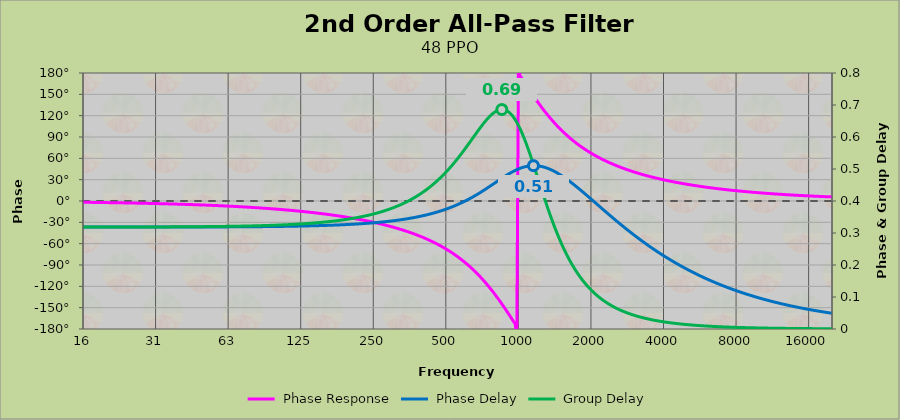
| Category |  Phase Response |
|---|---|
| 10.0 | -1.146 |
| 10.144952080687357 | -1.163 |
| 10.292005271944277 | -1.179 |
| 10.441190029805636 | -1.197 |
| 10.592537251772882 | -1.214 |
| 10.746078283213167 | -1.232 |
| 10.901844923851277 | -1.249 |
| 11.059869434355585 | -1.267 |
| 11.220184543019634 | -1.286 |
| 11.38282345254031 | -1.304 |
| 11.547819846894582 | -1.323 |
| 11.715207898315597 | -1.343 |
| 11.885022274370181 | -1.362 |
| 12.05729814513874 | -1.382 |
| 12.232071190499312 | -1.402 |
| 12.40937760751719 | -1.422 |
| 12.589254117941664 | -1.443 |
| 12.771737975811421 | -1.464 |
| 12.956866975170186 | -1.485 |
| 13.144679457894211 | -1.506 |
| 13.33521432163323 | -1.528 |
| 13.528511027866504 | -1.55 |
| 13.724609610075607 | -1.573 |
| 13.923550682035842 | -1.596 |
| 14.125375446227528 | -1.619 |
| 14.330125702369624 | -1.642 |
| 14.537843856076616 | -1.666 |
| 14.748572927641241 | -1.69 |
| 14.96235656094433 | -1.715 |
| 15.179239032493834 | -1.74 |
| 15.399265260594913 | -1.765 |
| 15.622480814652896 | -1.79 |
| 15.848931924611124 | -1.816 |
| 16.078665490525598 | -1.843 |
| 16.311729092278373 | -1.87 |
| 16.548170999431804 | -1.897 |
| 16.788040181225604 | -1.924 |
| 17.031386316718756 | -1.952 |
| 17.278259805078633 | -1.98 |
| 17.528711776018913 | -2.009 |
| 17.782794100389225 | -2.038 |
| 18.04055940091786 | -2.068 |
| 18.302061063110557 | -2.098 |
| 18.567353246307057 | -2.128 |
| 18.836490894897995 | -2.159 |
| 19.109529749704397 | -2.19 |
| 19.386526359522072 | -2.222 |
| 19.66753809283337 | -2.254 |
| 19.95262314968879 | -2.287 |
| 20.2418405737606 | -2.32 |
| 20.535250264571452 | -2.354 |
| 20.832912989899985 | -2.388 |
| 21.13489039836646 | -2.423 |
| 21.441245032200722 | -2.458 |
| 21.75204034019521 | -2.493 |
| 22.067340690845896 | -2.53 |
| 22.38721138568339 | -2.566 |
| 22.711718672797648 | -2.603 |
| 23.04092976055845 | -2.641 |
| 23.37491283153488 | -2.68 |
| 23.71373705661654 | -2.718 |
| 24.057472609339506 | -2.758 |
| 24.40619068041979 | -2.798 |
| 24.75996349249773 | -2.838 |
| 25.11886431509578 | -2.88 |
| 25.482967479793462 | -2.921 |
| 25.852348395621906 | -2.964 |
| 26.22708356468189 | -3.007 |
| 26.60725059798809 | -3.05 |
| 26.992928231542923 | -3.095 |
| 27.38419634264361 | -3.14 |
| 27.78113596642535 | -3.185 |
| 28.183829312644534 | -3.231 |
| 28.592359782705056 | -3.278 |
| 29.006811986931528 | -3.326 |
| 29.427271762092804 | -3.374 |
| 29.853826189179596 | -3.423 |
| 30.28656361143962 | -3.473 |
| 30.725573652674463 | -3.523 |
| 31.170947235801233 | -3.574 |
| 31.622776601683785 | -3.626 |
| 32.08115532823636 | -3.679 |
| 32.54617834980458 | -3.732 |
| 33.017941976827196 | -3.786 |
| 33.496543915782745 | -3.841 |
| 33.98208328942559 | -3.897 |
| 34.47466065731493 | -3.954 |
| 34.97437803664178 | -4.011 |
| 35.481338923357534 | -4.069 |
| 35.995648313608946 | -4.128 |
| 36.51741272548376 | -4.188 |
| 37.046740221071566 | -4.249 |
| 37.58374042884439 | -4.311 |
| 38.128524566361875 | -4.373 |
| 38.68120546330519 | -4.437 |
| 39.24189758484535 | -4.501 |
| 39.81071705534973 | -4.567 |
| 40.38778168243259 | -4.633 |
| 40.97321098135415 | -4.7 |
| 41.567126199773085 | -4.769 |
| 42.16965034285822 | -4.838 |
| 42.7809081987638 | -4.908 |
| 43.40102636447437 | -4.98 |
| 44.03013327202412 | -5.052 |
| 44.668359215096295 | -5.125 |
| 45.31583637600815 | -5.2 |
| 45.97269885308721 | -5.276 |
| 46.639082688444034 | -5.352 |
| 47.31512589614804 | -5.43 |
| 48.00096849081114 | -5.509 |
| 48.6967525165863 | -5.589 |
| 49.40262207658598 | -5.67 |
| 50.11872336272721 | -5.753 |
| 50.84520468600938 | -5.836 |
| 51.58221650723054 | -5.921 |
| 52.32991146814946 | -6.008 |
| 53.08844442309883 | -6.095 |
| 53.85797247105717 | -6.184 |
| 54.6386549881854 | -6.274 |
| 55.43065366083503 | -6.365 |
| 56.23413251903489 | -6.458 |
| 57.049257970463195 | -6.552 |
| 57.87619883491205 | -6.647 |
| 58.71512637925165 | -6.744 |
| 59.566214352901035 | -6.842 |
| 60.42963902381326 | -6.942 |
| 61.30557921498207 | -7.043 |
| 62.194216341477585 | -7.145 |
| 63.095734448019314 | -7.249 |
| 64.01032024709305 | -7.355 |
| 64.93816315762112 | -7.462 |
| 65.87945534419237 | -7.571 |
| 66.83439175686144 | -7.681 |
| 67.8031701715246 | -7.794 |
| 68.78599123088073 | -7.907 |
| 69.78305848598663 | -8.023 |
| 70.7945784384138 | -8.14 |
| 71.82076058301705 | -8.258 |
| 72.86181745132275 | -8.379 |
| 73.91796465554594 | -8.501 |
| 74.98942093324555 | -8.625 |
| 76.07640819262701 | -8.751 |
| 77.1791515585012 | -8.879 |
| 78.29787941891024 | -9.009 |
| 79.4328234724281 | -9.141 |
| 80.58421877614816 | -9.274 |
| 81.75230379436502 | -9.41 |
| 82.93732044796283 | -9.548 |
| 84.13951416451951 | -9.687 |
| 85.35913392913655 | -9.829 |
| 86.59643233600653 | -9.973 |
| 87.85166564072718 | -10.119 |
| 89.12509381337453 | -10.267 |
| 90.41698059234503 | -10.418 |
| 91.72759353897793 | -10.57 |
| 93.05720409296987 | -10.725 |
| 94.40608762859233 | -10.883 |
| 95.77452351172407 | -11.042 |
| 97.16279515771062 | -11.204 |
| 98.57119009006156 | -11.369 |
| 100.0 | -11.536 |
| 101.4495208068736 | -11.705 |
| 102.92005271944278 | -11.877 |
| 104.41190029805644 | -12.052 |
| 105.92537251772887 | -12.229 |
| 107.46078283213174 | -12.409 |
| 109.01844923851274 | -12.592 |
| 110.59869434355593 | -12.777 |
| 112.20184543019631 | -12.966 |
| 113.82823452540316 | -13.157 |
| 115.47819846894579 | -13.351 |
| 117.15207898315593 | -13.548 |
| 118.85022274370179 | -13.748 |
| 120.5729814513874 | -13.951 |
| 122.32071190499315 | -14.157 |
| 124.09377607517195 | -14.367 |
| 125.89254117941667 | -14.579 |
| 127.71737975811426 | -14.795 |
| 129.56866975170195 | -15.014 |
| 131.44679457894225 | -15.237 |
| 133.35214321633237 | -15.463 |
| 135.28511027866503 | -15.693 |
| 137.24609610075618 | -15.926 |
| 139.2355068203584 | -16.163 |
| 141.25375446227542 | -16.403 |
| 143.30125702369625 | -16.647 |
| 145.37843856076614 | -16.895 |
| 147.4857292764124 | -17.147 |
| 149.62356560944335 | -17.403 |
| 151.79239032493837 | -17.663 |
| 153.99265260594916 | -17.927 |
| 156.224808146529 | -18.195 |
| 158.4893192461113 | -18.468 |
| 160.78665490525609 | -18.745 |
| 163.1172909227838 | -19.026 |
| 165.4817099943181 | -19.312 |
| 167.880401812256 | -19.602 |
| 170.31386316718766 | -19.897 |
| 172.78259805078633 | -20.197 |
| 175.28711776018926 | -20.502 |
| 177.82794100389225 | -20.811 |
| 180.40559400917857 | -21.126 |
| 183.02061063110554 | -21.446 |
| 185.6735324630706 | -21.771 |
| 188.36490894898003 | -22.101 |
| 191.09529749704402 | -22.437 |
| 193.86526359522065 | -22.778 |
| 196.67538092833377 | -23.125 |
| 199.52623149688796 | -23.478 |
| 202.41840573760615 | -23.837 |
| 205.3525026457146 | -24.201 |
| 208.3291298989999 | -24.572 |
| 211.34890398366466 | -24.949 |
| 214.41245032200723 | -25.333 |
| 217.52040340195225 | -25.723 |
| 220.67340690845893 | -26.12 |
| 223.87211385683392 | -26.523 |
| 227.1171867279765 | -26.934 |
| 230.40929760558453 | -27.352 |
| 233.74912831534877 | -27.777 |
| 237.1373705661655 | -28.209 |
| 240.5747260933951 | -28.649 |
| 244.061906804198 | -29.097 |
| 247.59963492497735 | -29.553 |
| 251.188643150958 | -30.017 |
| 254.82967479793462 | -30.489 |
| 258.523483956219 | -30.97 |
| 262.27083564681897 | -31.459 |
| 266.07250597988093 | -31.958 |
| 269.92928231542936 | -32.465 |
| 273.84196342643605 | -32.982 |
| 277.8113596642535 | -33.508 |
| 281.8382931264453 | -34.045 |
| 285.9235978270507 | -34.591 |
| 290.0681198693154 | -35.148 |
| 294.2727176209282 | -35.715 |
| 298.53826189179597 | -36.293 |
| 302.8656361143963 | -36.882 |
| 307.2557365267447 | -37.483 |
| 311.70947235801253 | -38.095 |
| 316.22776601683796 | -38.719 |
| 320.81155328236355 | -39.356 |
| 325.46178349804586 | -40.005 |
| 330.179419768272 | -40.667 |
| 334.96543915782763 | -41.343 |
| 339.82083289425583 | -42.032 |
| 344.74660657314934 | -42.735 |
| 349.74378036641787 | -43.453 |
| 354.81338923357544 | -44.186 |
| 359.9564831360896 | -44.934 |
| 365.1741272548377 | -45.698 |
| 370.46740221071565 | -46.477 |
| 375.83740428844413 | -47.274 |
| 381.28524566361875 | -48.088 |
| 386.8120546330522 | -48.919 |
| 392.41897584845356 | -49.768 |
| 398.1071705534972 | -50.636 |
| 403.877816824326 | -51.524 |
| 409.73210981354146 | -52.431 |
| 415.67126199773105 | -53.358 |
| 421.6965034285822 | -54.307 |
| 427.809081987638 | -55.277 |
| 434.0102636447438 | -56.27 |
| 440.3013327202413 | -57.286 |
| 446.68359215096314 | -58.325 |
| 453.1583637600817 | -59.389 |
| 459.72698853087206 | -60.478 |
| 466.3908268844406 | -61.593 |
| 473.1512589614805 | -62.736 |
| 480.0096849081115 | -63.905 |
| 486.96752516586304 | -65.104 |
| 494.02622076585976 | -66.331 |
| 501.18723362727224 | -67.59 |
| 508.45204686009384 | -68.879 |
| 515.8221650723056 | -70.201 |
| 523.2991146814948 | -71.556 |
| 530.8844442309883 | -72.946 |
| 538.5797247105719 | -74.371 |
| 546.3865498818542 | -75.832 |
| 554.3065366083505 | -77.331 |
| 562.341325190349 | -78.868 |
| 570.4925797046319 | -80.446 |
| 578.7619883491207 | -82.064 |
| 587.1512637925165 | -83.725 |
| 595.6621435290103 | -85.429 |
| 604.2963902381327 | -87.177 |
| 613.0557921498206 | -88.971 |
| 621.9421634147761 | -90.812 |
| 630.9573444801932 | -92.701 |
| 640.1032024709308 | -94.639 |
| 649.3816315762114 | -96.627 |
| 658.7945534419239 | -98.666 |
| 668.3439175686145 | -100.758 |
| 678.0317017152458 | -102.903 |
| 687.8599123088075 | -105.101 |
| 697.8305848598662 | -107.355 |
| 707.9457843841379 | -109.664 |
| 718.2076058301706 | -112.028 |
| 728.6181745132277 | -114.45 |
| 739.1796465554596 | -116.927 |
| 749.8942093324558 | -119.462 |
| 760.7640819262703 | -122.053 |
| 771.7915155850123 | -124.7 |
| 782.9787941891024 | -127.403 |
| 794.3282347242815 | -130.161 |
| 805.8421877614819 | -132.973 |
| 817.52303794365 | -135.837 |
| 829.3732044796284 | -138.752 |
| 841.395141645195 | -141.715 |
| 853.5913392913658 | -144.726 |
| 865.9643233600654 | -147.781 |
| 878.5166564072719 | -150.877 |
| 891.2509381337454 | -154.011 |
| 904.1698059234504 | -157.18 |
| 917.2759353897795 | -160.38 |
| 930.572040929699 | -163.607 |
| 944.0608762859234 | -166.858 |
| 957.7452351172412 | -170.127 |
| 971.6279515771062 | -173.41 |
| 985.7119009006161 | -176.703 |
| 1000.0 | 180 |
| 1014.4952080687361 | 176.703 |
| 1029.2005271944283 | 173.41 |
| 1044.1190029805643 | 170.127 |
| 1059.253725177289 | 166.858 |
| 1074.6078283213174 | 163.607 |
| 1090.1844923851277 | 160.38 |
| 1105.9869434355596 | 157.18 |
| 1122.0184543019636 | 154.011 |
| 1138.282345254032 | 150.877 |
| 1154.7819846894583 | 147.781 |
| 1171.52078983156 | 144.726 |
| 1188.5022274370185 | 141.715 |
| 1205.7298145138743 | 138.752 |
| 1223.2071190499316 | 135.837 |
| 1240.9377607517197 | 132.973 |
| 1258.9254117941673 | 130.161 |
| 1277.173797581143 | 127.403 |
| 1295.6866975170196 | 124.7 |
| 1314.4679457894222 | 122.053 |
| 1333.5214321633239 | 119.462 |
| 1352.8511027866502 | 116.927 |
| 1372.460961007562 | 114.45 |
| 1392.355068203584 | 112.028 |
| 1412.5375446227545 | 109.664 |
| 1433.012570236963 | 107.355 |
| 1453.784385607662 | 105.101 |
| 1474.8572927641246 | 102.903 |
| 1496.2356560944334 | 100.758 |
| 1517.923903249384 | 98.666 |
| 1539.926526059492 | 96.627 |
| 1562.2480814652904 | 94.639 |
| 1584.8931924611136 | 92.701 |
| 1607.8665490525607 | 90.812 |
| 1631.1729092278383 | 88.971 |
| 1654.8170999431816 | 87.177 |
| 1678.8040181225606 | 85.429 |
| 1703.1386316718772 | 83.725 |
| 1727.8259805078635 | 82.064 |
| 1752.871177601893 | 80.446 |
| 1778.279410038923 | 78.868 |
| 1804.0559400917864 | 77.331 |
| 1830.2061063110561 | 75.832 |
| 1856.7353246307061 | 74.371 |
| 1883.6490894898009 | 72.946 |
| 1910.9529749704407 | 71.556 |
| 1938.6526359522074 | 70.201 |
| 1966.7538092833386 | 68.879 |
| 1995.2623149688798 | 67.59 |
| 2024.1840573760617 | 66.331 |
| 2053.5250264571464 | 65.104 |
| 2083.2912989899996 | 63.905 |
| 2113.489039836647 | 62.736 |
| 2144.1245032200723 | 61.593 |
| 2175.204034019523 | 60.478 |
| 2206.73406908459 | 59.389 |
| 2238.7211385683395 | 58.325 |
| 2271.171867279766 | 57.286 |
| 2304.0929760558456 | 56.27 |
| 2337.4912831534884 | 55.277 |
| 2371.3737056616555 | 54.307 |
| 2405.7472609339507 | 53.358 |
| 2440.6190680419804 | 52.431 |
| 2475.9963492497736 | 51.524 |
| 2511.8864315095807 | 50.636 |
| 2548.296747979347 | 49.768 |
| 2585.2348395621907 | 48.919 |
| 2622.7083564681907 | 48.088 |
| 2660.7250597988095 | 47.274 |
| 2699.2928231542937 | 46.477 |
| 2738.4196342643613 | 45.698 |
| 2778.1135966425354 | 44.934 |
| 2818.3829312644543 | 44.186 |
| 2859.2359782705066 | 43.453 |
| 2900.6811986931543 | 42.735 |
| 2942.7271762092823 | 42.032 |
| 2985.38261891796 | 41.343 |
| 3028.6563611439637 | 40.667 |
| 3072.5573652674466 | 40.005 |
| 3117.0947235801264 | 39.356 |
| 3162.2776601683795 | 38.719 |
| 3208.115532823636 | 38.095 |
| 3254.6178349804586 | 37.483 |
| 3301.7941976827206 | 36.882 |
| 3349.6543915782772 | 36.293 |
| 3398.208328942559 | 35.715 |
| 3447.4660657314935 | 35.148 |
| 3497.4378036641783 | 34.591 |
| 3548.1338923357553 | 34.045 |
| 3599.5648313608967 | 33.508 |
| 3651.7412725483778 | 32.982 |
| 3704.6740221071573 | 32.465 |
| 3758.374042884442 | 31.958 |
| 3812.8524566361893 | 31.459 |
| 3868.1205463305223 | 30.97 |
| 3924.189758484536 | 30.489 |
| 3981.071705534973 | 30.017 |
| 4038.77816824326 | 29.553 |
| 4097.321098135415 | 29.097 |
| 4156.71261997731 | 28.649 |
| 4216.965034285823 | 28.209 |
| 4278.090819876382 | 27.777 |
| 4340.102636447438 | 27.352 |
| 4403.013327202415 | 26.934 |
| 4466.835921509632 | 26.523 |
| 4531.583637600818 | 26.12 |
| 4597.269885308722 | 25.723 |
| 4663.908268844407 | 25.333 |
| 4731.512589614806 | 24.949 |
| 4800.0968490811165 | 24.572 |
| 4869.675251658632 | 24.201 |
| 4940.2622076585985 | 23.837 |
| 5011.872336272723 | 23.478 |
| 5084.520468600941 | 23.125 |
| 5158.221650723059 | 22.778 |
| 5232.991146814948 | 22.437 |
| 5308.8444423098845 | 22.101 |
| 5385.797247105719 | 21.771 |
| 5463.865498818544 | 21.446 |
| 5543.065366083507 | 21.126 |
| 5623.413251903492 | 20.811 |
| 5704.92579704632 | 20.502 |
| 5787.619883491207 | 20.197 |
| 5871.512637925167 | 19.897 |
| 5956.621435290105 | 19.602 |
| 6042.963902381329 | 19.312 |
| 6130.557921498207 | 19.026 |
| 6219.421634147761 | 18.745 |
| 6309.573444801934 | 18.468 |
| 6401.03202470931 | 18.195 |
| 6493.816315762115 | 17.927 |
| 6587.945534419239 | 17.663 |
| 6683.439175686146 | 17.403 |
| 6780.317017152461 | 17.147 |
| 6878.599123088078 | 16.895 |
| 6978.305848598665 | 16.647 |
| 7079.457843841379 | 16.403 |
| 7182.076058301706 | 16.163 |
| 7286.181745132279 | 15.926 |
| 7391.796465554597 | 15.693 |
| 7498.942093324559 | 15.463 |
| 7607.640819262701 | 15.237 |
| 7717.9151558501235 | 15.014 |
| 7829.787941891026 | 14.795 |
| 7943.282347242817 | 14.579 |
| 8058.421877614819 | 14.367 |
| 8175.230379436501 | 14.157 |
| 8293.732044796287 | 13.951 |
| 8413.951416451955 | 13.748 |
| 8535.913392913662 | 13.548 |
| 8659.643233600656 | 13.351 |
| 8785.16656407272 | 13.157 |
| 8912.509381337457 | 12.966 |
| 9041.698059234506 | 12.777 |
| 9172.759353897798 | 12.592 |
| 9305.72040929699 | 12.409 |
| 9440.608762859234 | 12.229 |
| 9577.452351172411 | 12.052 |
| 9716.279515771064 | 11.877 |
| 9857.119009006165 | 11.705 |
| 10000.0 | 11.536 |
| 10144.952080687368 | 11.369 |
| 10292.005271944281 | 11.204 |
| 10441.190029805648 | 11.042 |
| 10592.537251772888 | 10.883 |
| 10746.078283213177 | 10.725 |
| 10901.84492385128 | 10.57 |
| 11059.869434355598 | 10.418 |
| 11220.184543019635 | 10.267 |
| 11382.823452540322 | 10.119 |
| 11547.819846894583 | 9.973 |
| 11715.207898315604 | 9.829 |
| 11885.022274370185 | 9.687 |
| 12057.298145138746 | 9.548 |
| 12232.071190499313 | 9.41 |
| 12409.377607517199 | 9.274 |
| 12589.25411794168 | 9.141 |
| 12771.73797581143 | 9.009 |
| 12956.8669751702 | 8.879 |
| 13144.679457894223 | 8.751 |
| 13335.214321633244 | 8.625 |
| 13528.511027866507 | 8.501 |
| 13724.609610075622 | 8.379 |
| 13923.550682035844 | 8.258 |
| 14125.375446227545 | 8.14 |
| 14330.125702369627 | 8.023 |
| 14537.843856076624 | 7.907 |
| 14748.572927641246 | 7.794 |
| 14962.35656094434 | 7.681 |
| 15179.239032493844 | 7.571 |
| 15399.265260594922 | 7.462 |
| 15622.480814652912 | 7.355 |
| 15848.931924611137 | 7.249 |
| 16078.665490525616 | 7.145 |
| 16311.729092278383 | 7.043 |
| 16548.170999431823 | 6.942 |
| 16788.040181225606 | 6.842 |
| 17031.386316718774 | 6.744 |
| 17278.259805078636 | 6.647 |
| 17528.711776018932 | 6.552 |
| 17782.794100389234 | 6.458 |
| 18040.55940091787 | 6.365 |
| 18302.061063110566 | 6.274 |
| 18567.35324630707 | 6.184 |
| 18836.49089489801 | 6.095 |
| 19109.52974970441 | 6.008 |
| 19386.526359522082 | 5.921 |
| 19667.538092833387 | 5.836 |
| 19952.623149688803 | 5.753 |